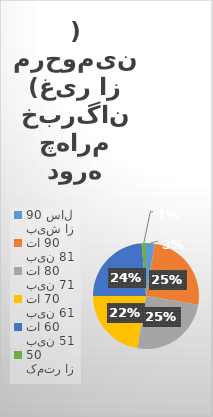
| Category | Series 0 |
|---|---|
| بیش از 90 سال | 2 |
| بین 81 تا 90 | 19 |
| بین 71  تا 80 | 19 |
| بین 61 تا 70 | 17 |
| بین 51 تا 60 | 18 |
| کمتر از 50 | 1 |